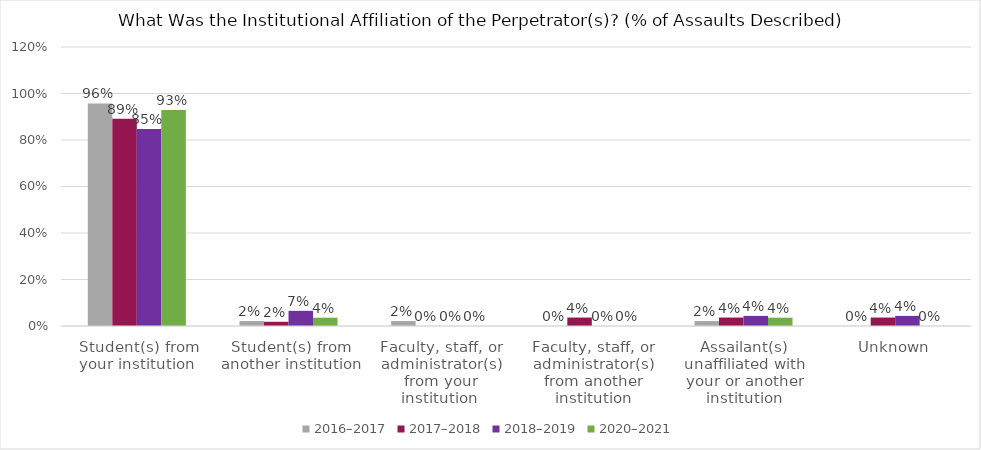
| Category | 2016–2017 | 2017–2018 | 2018–2019 | 2020–2021 |
|---|---|---|---|---|
| Student(s) from your institution  | 0.957 | 0.891 | 0.848 | 0.929 |
| Student(s) from another institution | 0.021 | 0.018 | 0.065 | 0.036 |
| Faculty, staff, or administrator(s) from your institution  | 0.021 | 0 | 0 | 0 |
| Faculty, staff, or administrator(s) from another institution | 0 | 0.036 | 0 | 0 |
| Assailant(s) unaffiliated with your or another institution | 0.021 | 0.036 | 0.043 | 0.036 |
| Unknown | 0 | 0.036 | 0.043 | 0 |